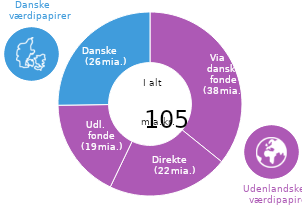
| Category | Akkumuleret nettokøb |
|---|---|
| Via danske fonde | 37.604 |
| Direkte | 22.391 |
| Udl. Fonde | 18.567 |
| Danske | 26.489 |